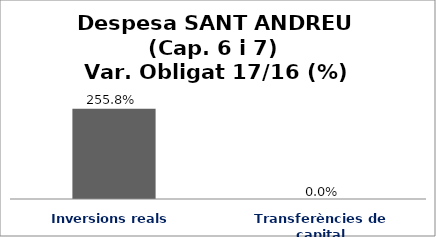
| Category | Series 0 |
|---|---|
| Inversions reals | 2.558 |
| Transferències de capital | 0 |